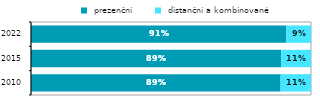
| Category |  prezenční |  distanční a kombinované |
|---|---|---|
| 2010.0 | 0.891 | 0.109 |
| 2015.0 | 0.894 | 0.106 |
| 2022.0 | 0.912 | 0.088 |